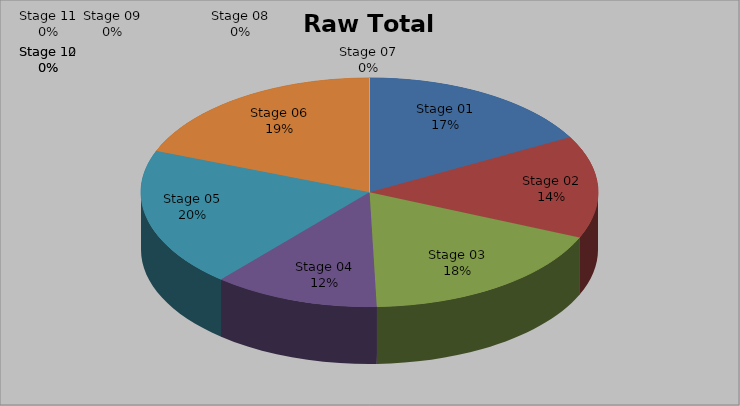
| Category | Raw Total Seconds |
|---|---|
| Stage 01 | 832.94 |
| Stage 02 | 707.18 |
| Stage 03 | 883.14 |
| Stage 04 | 575.26 |
| Stage 05 | 962.13 |
| Stage 06 | 935.31 |
| Stage 07 | 0 |
| Stage 08 | 0 |
| Stage 09 | 0 |
| Stage 10 | 0 |
| Stage 11 | 0 |
| Stage 12 | 0 |